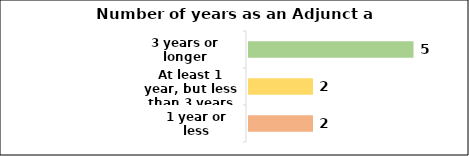
| Category | 1 year or less |
|---|---|
| 1 year or less | 2 |
| At least 1 year, but less than 3 years | 2 |
| 3 years or longer | 5 |